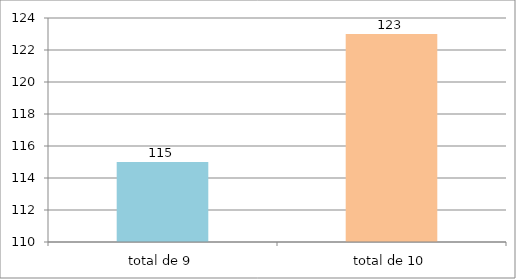
| Category | Series 0 |
|---|---|
| total de 9 | 115 |
| total de 10 | 123 |